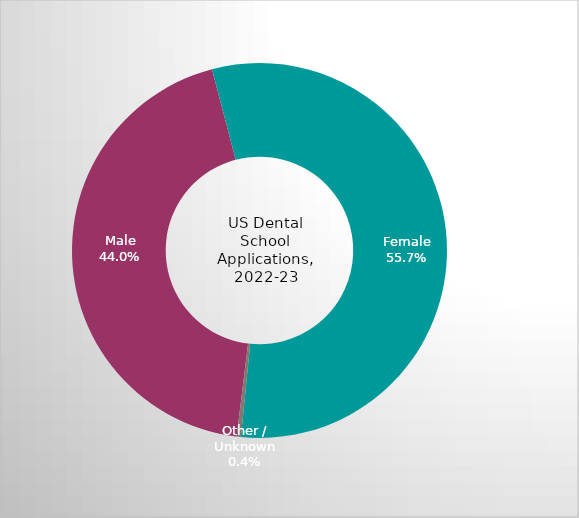
| Category | United States  |
|---|---|
| Male | 0.44 |
| Female | 0.557 |
| Other / Unknown | 0.004 |